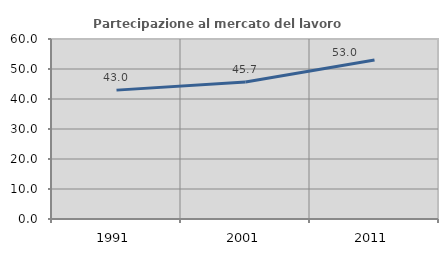
| Category | Partecipazione al mercato del lavoro  femminile |
|---|---|
| 1991.0 | 42.958 |
| 2001.0 | 45.679 |
| 2011.0 | 53.012 |